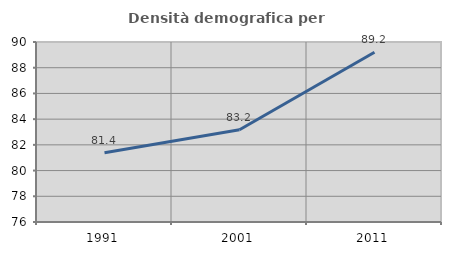
| Category | Densità demografica |
|---|---|
| 1991.0 | 81.389 |
| 2001.0 | 83.169 |
| 2011.0 | 89.202 |